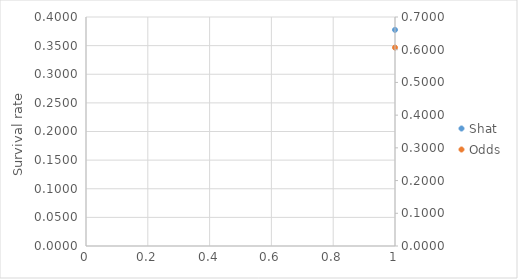
| Category | Shat |
|---|---|
| 0 | 0.378 |
| 1 | 0.31 |
| 2 | 0.25 |
| 3 | 0.198 |
| 4 | 0.154 |
| 5 | 0.119 |
| 6 | 0.091 |
| 7 | 0.069 |